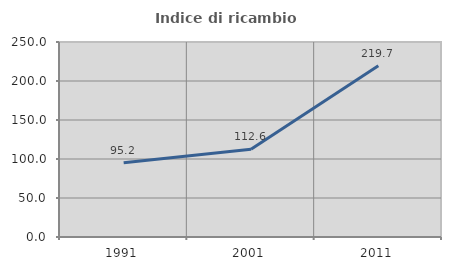
| Category | Indice di ricambio occupazionale  |
|---|---|
| 1991.0 | 95.2 |
| 2001.0 | 112.632 |
| 2011.0 | 219.697 |